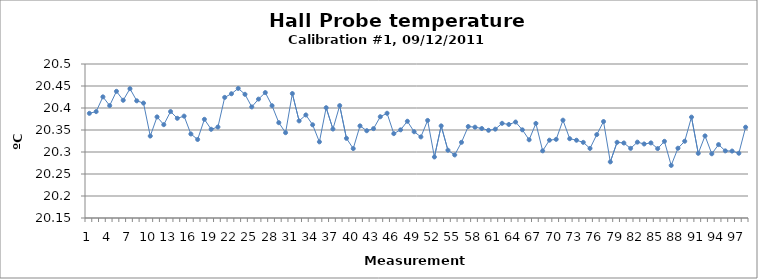
| Category | Series 0 |
|---|---|
| 0 | 20.388 |
| 1 | 20.392 |
| 2 | 20.425 |
| 3 | 20.405 |
| 4 | 20.438 |
| 5 | 20.418 |
| 6 | 20.444 |
| 7 | 20.416 |
| 8 | 20.411 |
| 9 | 20.336 |
| 10 | 20.38 |
| 11 | 20.362 |
| 12 | 20.392 |
| 13 | 20.377 |
| 14 | 20.382 |
| 15 | 20.341 |
| 16 | 20.328 |
| 17 | 20.374 |
| 18 | 20.352 |
| 19 | 20.357 |
| 20 | 20.424 |
| 21 | 20.432 |
| 22 | 20.445 |
| 23 | 20.431 |
| 24 | 20.402 |
| 25 | 20.42 |
| 26 | 20.435 |
| 27 | 20.405 |
| 28 | 20.367 |
| 29 | 20.344 |
| 30 | 20.433 |
| 31 | 20.371 |
| 32 | 20.384 |
| 33 | 20.362 |
| 34 | 20.323 |
| 35 | 20.401 |
| 36 | 20.352 |
| 37 | 20.405 |
| 38 | 20.331 |
| 39 | 20.308 |
| 40 | 20.359 |
| 41 | 20.348 |
| 42 | 20.353 |
| 43 | 20.38 |
| 44 | 20.388 |
| 45 | 20.342 |
| 46 | 20.35 |
| 47 | 20.37 |
| 48 | 20.346 |
| 49 | 20.334 |
| 50 | 20.372 |
| 51 | 20.289 |
| 52 | 20.359 |
| 53 | 20.304 |
| 54 | 20.293 |
| 55 | 20.322 |
| 56 | 20.358 |
| 57 | 20.356 |
| 58 | 20.353 |
| 59 | 20.349 |
| 60 | 20.352 |
| 61 | 20.365 |
| 62 | 20.363 |
| 63 | 20.368 |
| 64 | 20.35 |
| 65 | 20.328 |
| 66 | 20.365 |
| 67 | 20.303 |
| 68 | 20.327 |
| 69 | 20.329 |
| 70 | 20.372 |
| 71 | 20.33 |
| 72 | 20.327 |
| 73 | 20.322 |
| 74 | 20.308 |
| 75 | 20.34 |
| 76 | 20.369 |
| 77 | 20.278 |
| 78 | 20.322 |
| 79 | 20.32 |
| 80 | 20.308 |
| 81 | 20.322 |
| 82 | 20.318 |
| 83 | 20.321 |
| 84 | 20.308 |
| 85 | 20.324 |
| 86 | 20.27 |
| 87 | 20.309 |
| 88 | 20.324 |
| 89 | 20.379 |
| 90 | 20.297 |
| 91 | 20.337 |
| 92 | 20.296 |
| 93 | 20.317 |
| 94 | 20.303 |
| 95 | 20.302 |
| 96 | 20.297 |
| 97 | 20.356 |